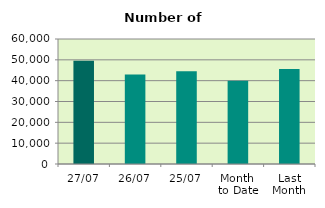
| Category | Series 0 |
|---|---|
| 27/07 | 49522 |
| 26/07 | 42940 |
| 25/07 | 44534 |
| Month 
to Date | 39926.737 |
| Last
Month | 45645.364 |